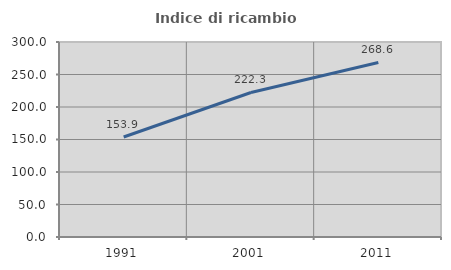
| Category | Indice di ricambio occupazionale  |
|---|---|
| 1991.0 | 153.896 |
| 2001.0 | 222.321 |
| 2011.0 | 268.571 |